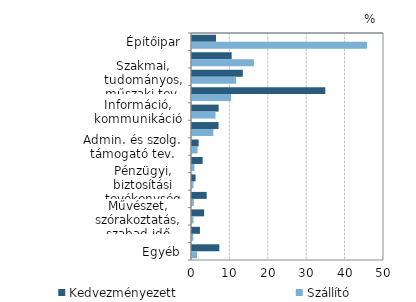
| Category | Kedvezményezett | Szállító |
|---|---|---|
| Építőipar | 6.257 | 45.573 |
| Kereskedelem, gépjárműjavítás | 10.335 | 16.126 |
| Szakmai, tudományos, műszaki tev. | 13.23 | 11.503 |
| Feldolgozóipar | 34.714 | 10.173 |
| Információ, kommunikáció | 6.934 | 6.129 |
| Ingatlanügyletek | 6.911 | 5.552 |
| Admin. és szolg. támogató tev. | 1.729 | 1.439 |
| Egyéb szolgáltatás | 2.781 | 0.645 |
| Pénzügyi, biztosítási tevékenység | 0.927 | 0.387 |
| Szállítás, raktározás | 3.83 | 0.471 |
| Művészet, szórakoztatás, szabad idő | 3.16 | 0.385 |
| Vízellátás, szennyvíz, hulladékgazd. | 2.067 | 0.322 |
| Egyéb | 7.126 | 1.295 |